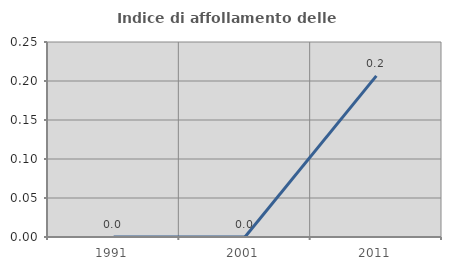
| Category | Indice di affollamento delle abitazioni  |
|---|---|
| 1991.0 | 0 |
| 2001.0 | 0 |
| 2011.0 | 0.207 |